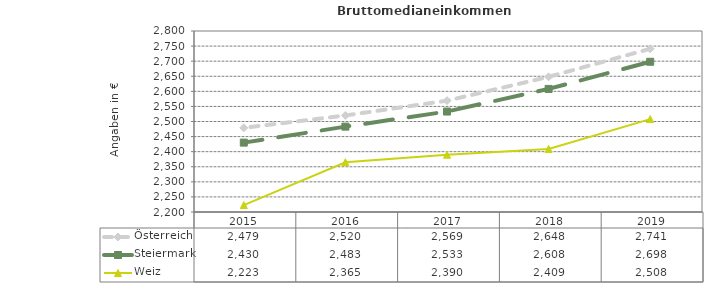
| Category | Österreich | Steiermark | Weiz |
|---|---|---|---|
| 2019.0 | 2741 | 2698 | 2508 |
| 2018.0 | 2648 | 2608 | 2409 |
| 2017.0 | 2569 | 2533 | 2390 |
| 2016.0 | 2520 | 2483 | 2365 |
| 2015.0 | 2479 | 2430 | 2223 |